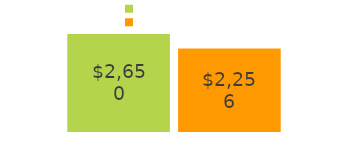
| Category | coming in | going out |
|---|---|---|
| money coming in: | 2650 | 2256 |